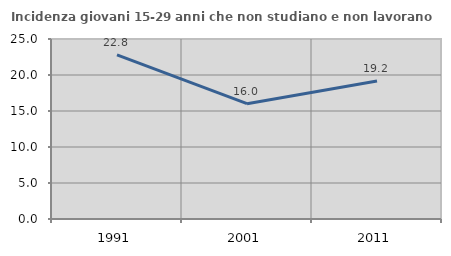
| Category | Incidenza giovani 15-29 anni che non studiano e non lavorano  |
|---|---|
| 1991.0 | 22.807 |
| 2001.0 | 16.016 |
| 2011.0 | 19.159 |